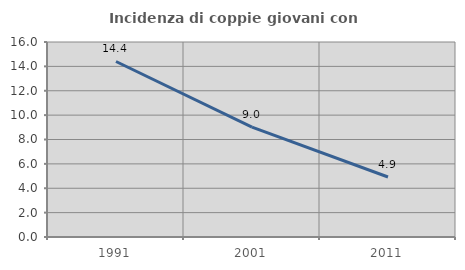
| Category | Incidenza di coppie giovani con figli |
|---|---|
| 1991.0 | 14.402 |
| 2001.0 | 9.015 |
| 2011.0 | 4.922 |